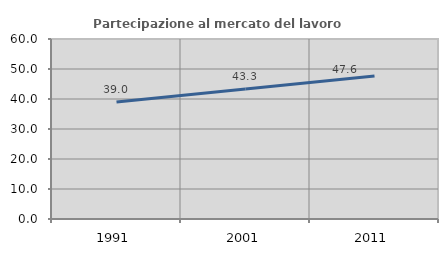
| Category | Partecipazione al mercato del lavoro  femminile |
|---|---|
| 1991.0 | 38.968 |
| 2001.0 | 43.34 |
| 2011.0 | 47.631 |